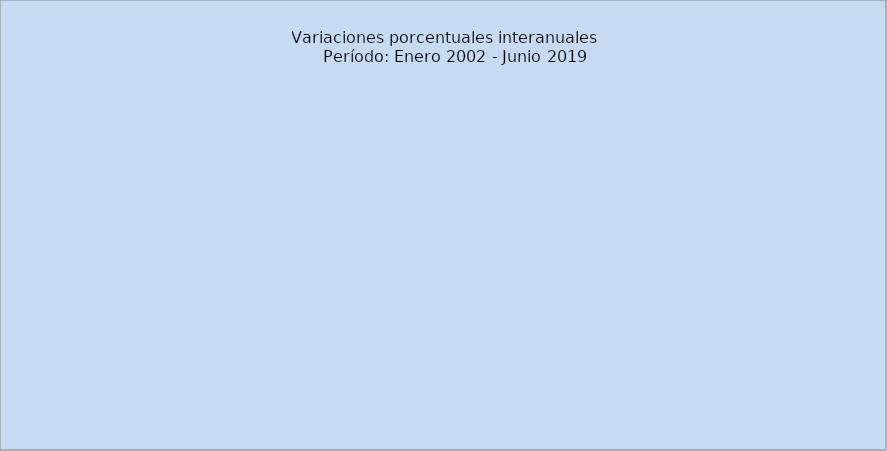
| Category | Serie Original |
|---|---|
| 2002 | 10.533 |
| f | 1.656 |
| m | 1.334 |
| a | 3.927 |
| m | 7.52 |
| j | 8.384 |
| j | 4.644 |
| a | 3.358 |
| s | 8.133 |
| o | 6.477 |
| n | 3.231 |
| d | 4.147 |
| 2003 | 3.277 |
| f | 7.996 |
| m | 0.338 |
| a | 4.258 |
| m | -3.563 |
| j | 8.754 |
| j | -1.171 |
| a | 5.24 |
| s | 2.255 |
| o | -1.387 |
| n | 2.786 |
| d | 4.402 |
| 2004 | 2.57 |
| f | 1.648 |
| m | 0.803 |
| a | 2.037 |
| m | 2.607 |
| j | 2.149 |
| j | 3.454 |
| a | 4.648 |
| s | 3.941 |
| o | 8.997 |
| n | 5.428 |
| d | 7.746 |
| 2005 | 5.533 |
| f | 10.588 |
| m | 10.34 |
| a | 6.921 |
| m | 3.211 |
| j | 4.172 |
| j | 3.809 |
| a | 3.621 |
| s | -1.574 |
| o | -5.972 |
| n | -5.491 |
| d | 0.893 |
| 2006 | -0.454 |
| f | -6.219 |
| m | 0.89 |
| a | -3.469 |
| m | 3.878 |
| j | -2.195 |
| j | 4.98 |
| a | -1.077 |
| s | 1.03 |
| o | 3.882 |
| n | 8.015 |
| d | 2.307 |
| 2007 | 10.756 |
| f | 15.604 |
| m | 3.821 |
| a | 10.294 |
| m | 2.769 |
| j | 10.949 |
| j | 6.62 |
| a | 8.799 |
| s | 6.296 |
| o | -1.521 |
| n | 3.185 |
| d | 0.237 |
| 2008 | 0.342 |
| f | -5.38 |
| m | -1.057 |
| a | -8.212 |
| m | 1.181 |
| j | 2.704 |
| j | -0.041 |
| a | 2.477 |
| s | 1.8 |
| o | 8.481 |
| n | 0.488 |
| d | 4.264 |
| 2009 | 3.783 |
| f | 8.053 |
| m | 6.144 |
| a | 9.108 |
| m | 1.742 |
| j | -1.757 |
| j | -0.002 |
| a | 1.308 |
| s | 1.958 |
| o | 2.245 |
| n | 6.741 |
| d | 6.588 |
| 2010 | 6.305 |
| f | 1.317 |
| m | 2.038 |
| a | 1.832 |
| m | 1.674 |
| j | -1.932 |
| j | -2.235 |
| a | -2.44 |
| s | -2.285 |
| o | -0.658 |
| n | -3.403 |
| d | -1.675 |
| 2011 | -2.671 |
| f | 0.475 |
| m | 0.738 |
| a | 3.677 |
| m | 7.655 |
| j | 6.712 |
| j | 8.345 |
| a | 5.6 |
| s | 6.242 |
| o | 7.371 |
| n | 8.467 |
| d | 6.412 |
| 2012 | 3.462 |
| f | 6.069 |
| m | 6.593 |
| a | -0.331 |
| m | 2.721 |
| j | 6.941 |
| j | 0.532 |
| a | 5.326 |
| s | 6.89 |
| o | 6.037 |
| n | 5.606 |
| d | 7.329 |
| 2013 | 8.477 |
| f | 9.743 |
| m | 8.993 |
| a | 10.728 |
| m | 3.727 |
| j | 2.618 |
| j | 6.778 |
| a | 6.824 |
| s | 0.362 |
| o | -0.894 |
| n | 2.124 |
| d | 3.624 |
| 2014 | 2.065 |
| f | 2.926 |
| m | 5.531 |
| a | 7.008 |
| m | 5.062 |
| j | 2.734 |
| j | 3.775 |
| a | 1.738 |
| s | 1.92 |
| o | 1.01 |
| n  | 2.537 |
| d | 3.213 |
| 2015 | 3.73 |
| f | 4.267 |
| m | 3.577 |
| a | 2.528 |
| m | 2.271 |
| j | 3.005 |
| j | 2.39 |
| a | 2.576 |
| s | 2.318 |
| o | 3.149 |
| n  | 4.004 |
| d | 3.628 |
| 2016 | 2.848 |
| f | 2.193 |
| m | 1.545 |
| a | 2.312 |
| m | 3.549 |
| j | 4.138 |
| j | 2.068 |
| a | 5.485 |
| s | 3.541 |
| o | 2.258 |
| n | 4.194 |
| d | 3.05 |
| 2017 | 1.499 |
| f | 4.034 |
| m | 2.145 |
| a | 1.953 |
| m | 1.187 |
| j | 2.663 |
| j | 5.321 |
| a | 3.601 |
| s | 2.461 |
| o | 4.67 |
| n | 3.851 |
| d | 1.948 |
| 2018 | 1.184 |
| f | 1.684 |
| m | 1.658 |
| a | 1.911 |
| m | 5.844 |
| j | 4.037 |
| j | 0.219 |
| a | 1.991 |
| s | 3.964 |
| o | 4.438 |
| n | 0.793 |
| d | 2.148 |
| 2019 | 2.688 |
| f | 1.879 |
| m | 1.788 |
| a | 0.807 |
| m | 3.377 |
| j | 1.581 |